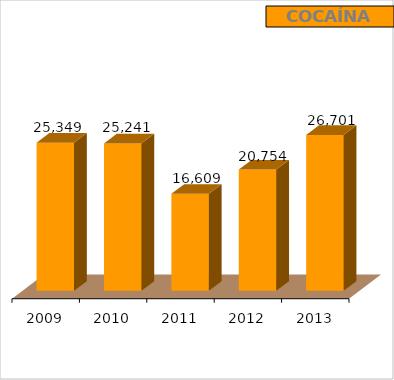
| Category | Cocaína |
|---|---|
| 2009.0 | 25349 |
| 2010.0 | 25241 |
| 2011.0 | 16609 |
| 2012.0 | 20754 |
| 2013.0 | 26701 |